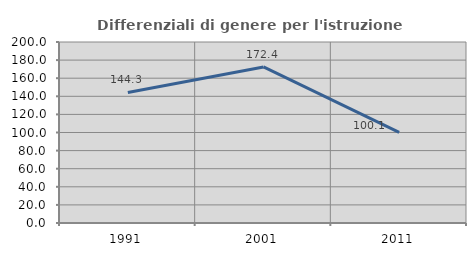
| Category | Differenziali di genere per l'istruzione superiore |
|---|---|
| 1991.0 | 144.286 |
| 2001.0 | 172.421 |
| 2011.0 | 100.103 |